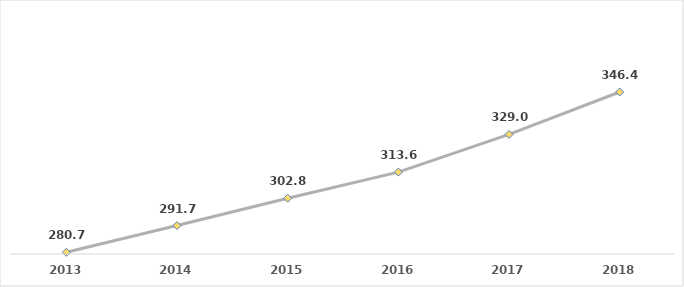
| Category | Series 0 |
|---|---|
| 2013.0 | 280.693 |
| 2014.0 | 291.651 |
| 2015.0 | 302.841 |
| 2016.0 | 313.561 |
| 2017.0 | 328.992 |
| 2018.0 | 346.393 |